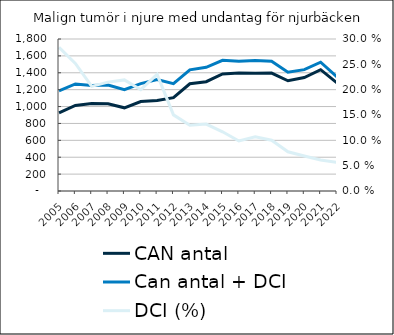
| Category |  CAN antal  |  Can antal + DCI  |
|---|---|---|
| 2005.0 | 924 | 1186 |
| 2006.0 | 1013 | 1268 |
| 2007.0 | 1036 | 1250 |
| 2008.0 | 1033 | 1255 |
| 2009.0 | 985 | 1201 |
| 2010.0 | 1060 | 1272 |
| 2011.0 | 1073 | 1320 |
| 2012.0 | 1105 | 1271 |
| 2013.0 | 1270 | 1435 |
| 2014.0 | 1294 | 1465 |
| 2015.0 | 1386 | 1548 |
| 2016.0 | 1398 | 1536 |
| 2017.0 | 1395 | 1544 |
| 2018.0 | 1396 | 1536 |
| 2019.0 | 1305 | 1406 |
| 2020.0 | 1344 | 1437 |
| 2021.0 | 1437 | 1525 |
| 2022.0 | 1279 | 1351 |